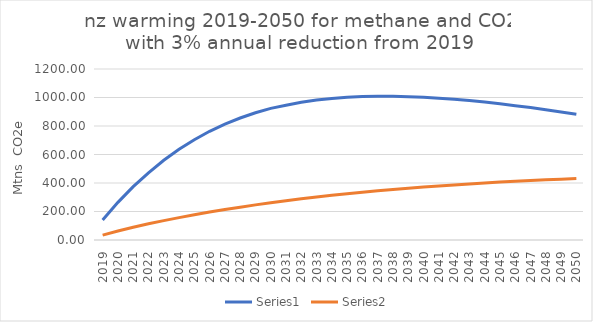
| Category | Series 0 | Series 1 |
|---|---|---|
| 2019.0 | 139.68 | 34.46 |
| 2020.0 | 263.995 | 63.579 |
| 2021.0 | 374.795 | 89.587 |
| 2022.0 | 471.78 | 113.603 |
| 2023.0 | 559.556 | 136.039 |
| 2024.0 | 636.358 | 157.117 |
| 2025.0 | 703.809 | 177.212 |
| 2026.0 | 762.952 | 196.014 |
| 2027.0 | 813.35 | 213.564 |
| 2028.0 | 855.975 | 230.411 |
| 2029.0 | 893.161 | 246.417 |
| 2030.0 | 923.639 | 261.422 |
| 2031.0 | 945.557 | 275.635 |
| 2032.0 | 966.211 | 289.076 |
| 2033.0 | 982.08 | 301.938 |
| 2034.0 | 993.198 | 313.904 |
| 2035.0 | 1001.225 | 324.989 |
| 2036.0 | 1006.206 | 335.4 |
| 2037.0 | 1008.228 | 345.151 |
| 2038.0 | 1008.113 | 354.433 |
| 2039.0 | 1005.894 | 363.271 |
| 2040.0 | 1001.602 | 371.499 |
| 2041.0 | 995.375 | 379.309 |
| 2042.0 | 987.929 | 386.709 |
| 2043.0 | 978.591 | 393.714 |
| 2044.0 | 968.146 | 400.167 |
| 2045.0 | 955.923 | 406.251 |
| 2046.0 | 942.643 | 411.983 |
| 2047.0 | 929.067 | 417.37 |
| 2048.0 | 913.799 | 422.426 |
| 2049.0 | 898.286 | 426.987 |
| 2050.0 | 882.534 | 431.235 |